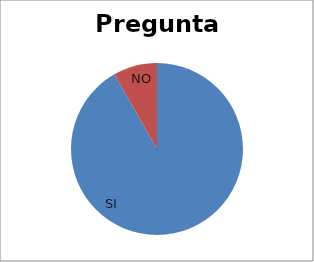
| Category | Series 0 |
|---|---|
| SI | 367 |
| NO | 33 |